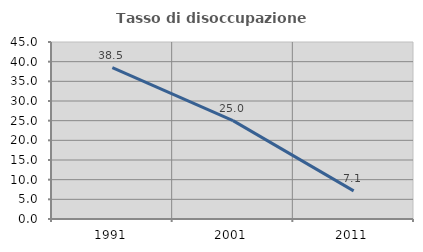
| Category | Tasso di disoccupazione giovanile  |
|---|---|
| 1991.0 | 38.462 |
| 2001.0 | 25 |
| 2011.0 | 7.143 |